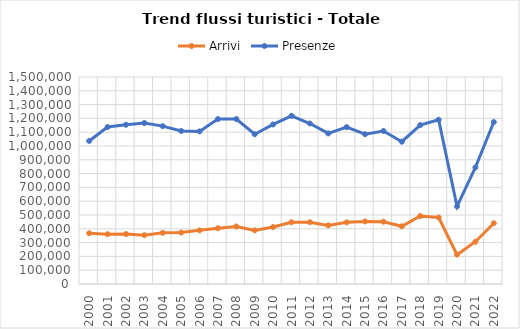
| Category | Arrivi | Presenze |
|---|---|---|
| 2000.0 | 367665 | 1036672 |
| 2001.0 | 360837 | 1137249 |
| 2002.0 | 361970 | 1154069 |
| 2003.0 | 353699 | 1166432 |
| 2004.0 | 371258 | 1143924 |
| 2005.0 | 372633 | 1108811 |
| 2006.0 | 388667 | 1105918 |
| 2007.0 | 404018 | 1195203 |
| 2008.0 | 416687 | 1195038 |
| 2009.0 | 388625 | 1085292 |
| 2010.0 | 412655 | 1156068 |
| 2011.0 | 447534 | 1218633 |
| 2012.0 | 447522 | 1162997 |
| 2013.0 | 424934 | 1091160 |
| 2014.0 | 446743 | 1136568 |
| 2015.0 | 453457 | 1085445 |
| 2016.0 | 451585 | 1108699 |
| 2017.0 | 418113 | 1031244 |
| 2018.0 | 492596 | 1151581 |
| 2019.0 | 481937 | 1190376 |
| 2020.0 | 212663 | 562413 |
| 2021.0 | 306359 | 845263 |
| 2022.0 | 440489 | 1173512 |